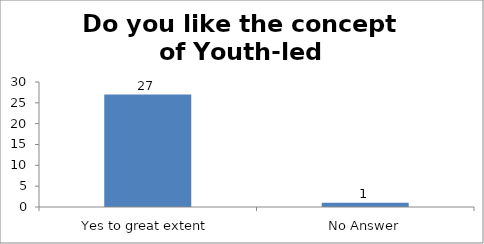
| Category | Do you like the concept of Youth-led Changemaking?  |
|---|---|
| Yes to great extent | 27 |
| No Answer | 1 |